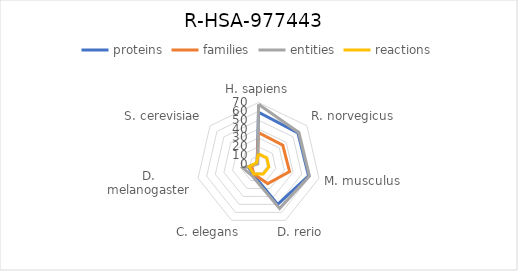
| Category | proteins | families | entities | reactions |
|---|---|---|---|---|
| H. sapiens | 59 | 36 | 68 | 12 |
| R. norvegicus | 57 | 35 | 58 | 12 |
| M. musculus | 58 | 36 | 59 | 12 |
| D. rerio | 50 | 24 | 55 | 12 |
| C. elegans | 13 | 12 | 15 | 12 |
| D. melanogaster | 12 | 8 | 18 | 11 |
| S. cerevisiae | 2 | 2 | 1 | 3 |